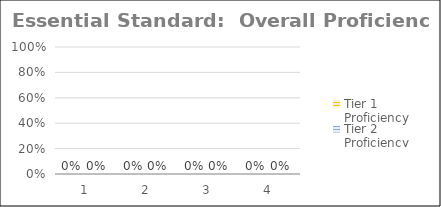
| Category | Tier 1 Proficiency | Tier 2 Proficiency |
|---|---|---|
| 0 | 0 | 0 |
| 1 | 0 | 0 |
| 2 | 0 | 0 |
| 3 | 0 | 0 |